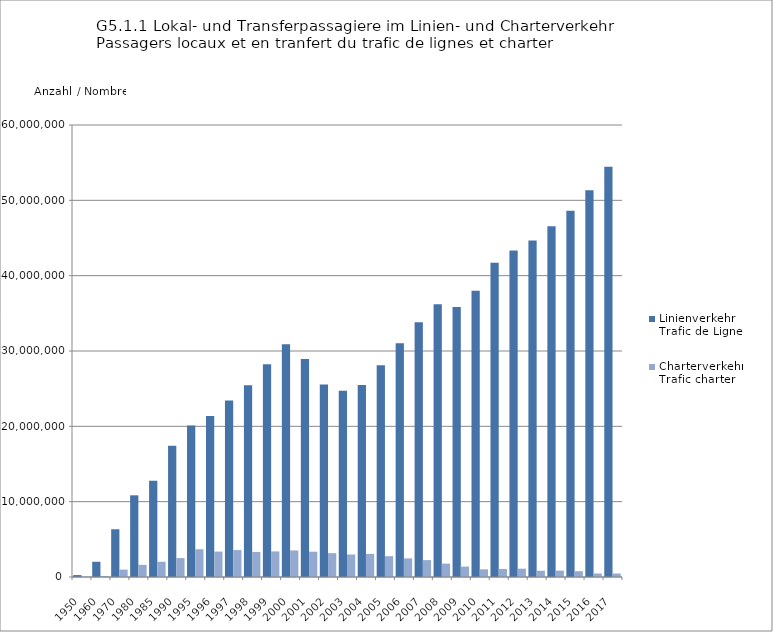
| Category | Linienverkehr Trafic de Lignes | Charterverkehr Trafic charter |
|---|---|---|
| 1950.0 | 253841 | 41022 |
| 1960.0 | 2023236 | 137323 |
| 1970.0 | 6337115 | 976936 |
| 1980.0 | 10841892 | 1613283 |
| 1985.0 | 12793091 | 2020245 |
| 1990.0 | 17429429 | 2512970 |
| 1995.0 | 20125817 | 3681340 |
| 1996.0 | 21357627 | 3373923 |
| 1997.0 | 23441048 | 3576564 |
| 1998.0 | 25458347 | 3322957 |
| 1999.0 | 28247600 | 3398247 |
| 2000.0 | 30903947 | 3522854 |
| 2001.0 | 28935233 | 3356535 |
| 2002.0 | 25550674 | 3166327 |
| 2003.0 | 24738668 | 2984620 |
| 2004.0 | 25496561 | 3074237 |
| 2005.0 | 28096814 | 2763237 |
| 2006.0 | 31017882 | 2470001 |
| 2007.0 | 33826265 | 2240899 |
| 2008.0 | 36221048 | 1774796 |
| 2009.0 | 35853037 | 1381990 |
| 2010.0 | 37991700 | 1017346 |
| 2011.0 | 41704038 | 1069301 |
| 2012.0 | 43341576 | 1102634 |
| 2013.0 | 44675890 | 825643 |
| 2014.0 | 46558454 | 847977 |
| 2015.0 | 48626319 | 766381 |
| 2016.0 | 51334271 | 466259 |
| 2017.0 | 54451314 | 460591 |